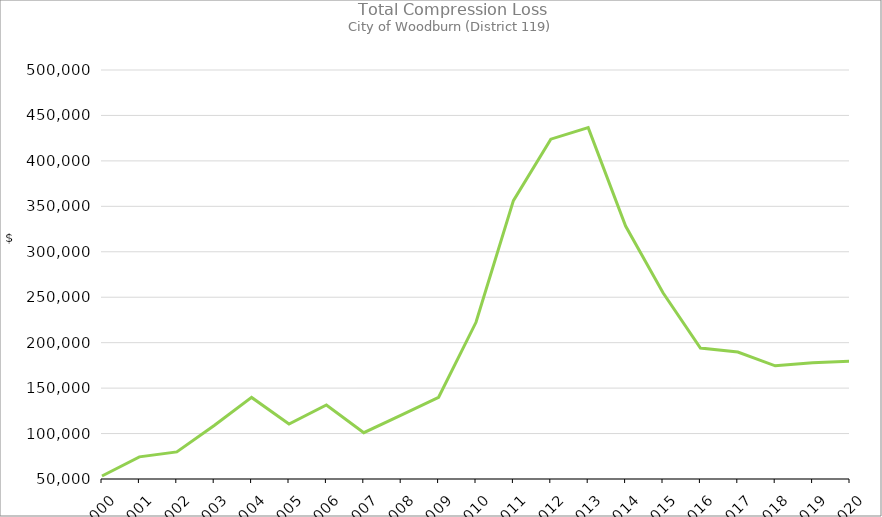
| Category | Series 0 |
|---|---|
| 2000.0 | 53267.87 |
| 2001.0 | 74392.88 |
| 2002.0 | 79831.21 |
| 2003.0 | 108928 |
| 2004.0 | 139758.57 |
| 2005.0 | 110479.33 |
| 2006.0 | 131441.18 |
| 2007.0 | 101000.06 |
| 2008.0 | 120318.06 |
| 2009.0 | 139905.88 |
| 2010.0 | 222398.65 |
| 2011.0 | 356279.78 |
| 2012.0 | 423895.26 |
| 2013.0 | 436590.52 |
| 2014.0 | 328290.42 |
| 2015.0 | 254834.46 |
| 2016.0 | 194072.11 |
| 2017.0 | 189672.81 |
| 2018.0 | 174501.14 |
| 2019.0 | 177993.1 |
| 2020.0 | 179485.37 |